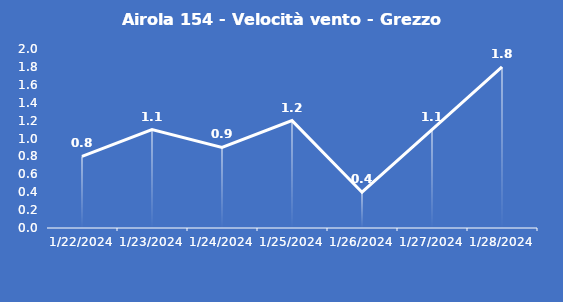
| Category | Airola 154 - Velocità vento - Grezzo (m/s) |
|---|---|
| 1/22/24 | 0.8 |
| 1/23/24 | 1.1 |
| 1/24/24 | 0.9 |
| 1/25/24 | 1.2 |
| 1/26/24 | 0.4 |
| 1/27/24 | 1.1 |
| 1/28/24 | 1.8 |